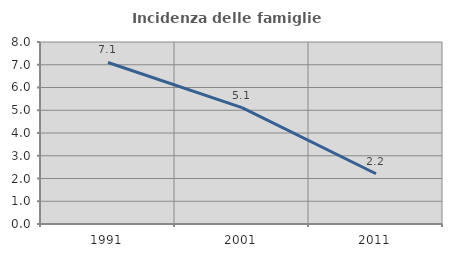
| Category | Incidenza delle famiglie numerose |
|---|---|
| 1991.0 | 7.099 |
| 2001.0 | 5.114 |
| 2011.0 | 2.21 |